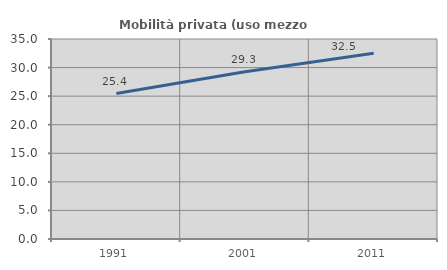
| Category | Mobilità privata (uso mezzo privato) |
|---|---|
| 1991.0 | 25.45 |
| 2001.0 | 29.268 |
| 2011.0 | 32.52 |